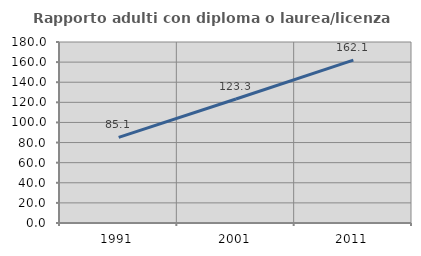
| Category | Rapporto adulti con diploma o laurea/licenza media  |
|---|---|
| 1991.0 | 85.139 |
| 2001.0 | 123.275 |
| 2011.0 | 162.05 |